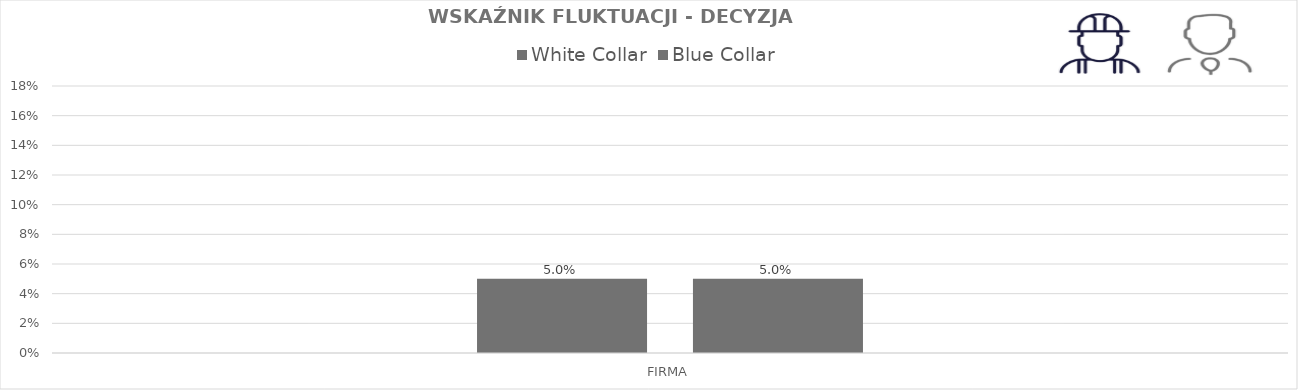
| Category | White Collar | Blue Collar |
|---|---|---|
| FIRMA | 0.05 | 0.05 |